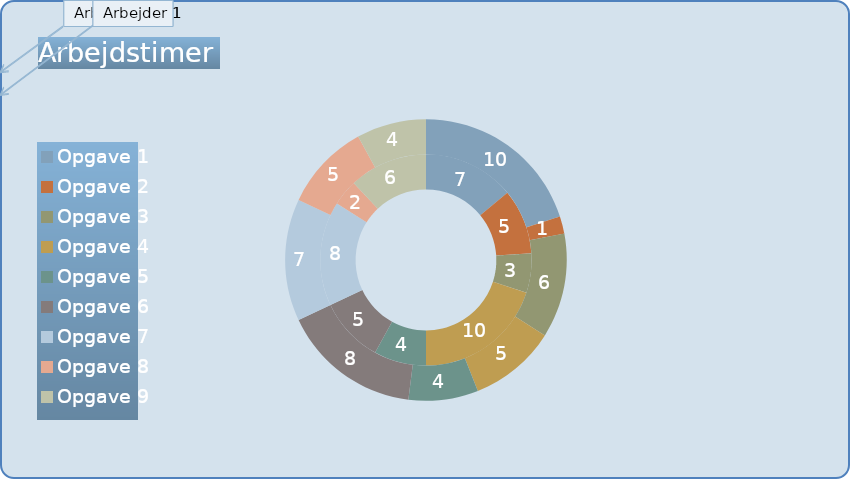
| Category | Arbejder 1 (timer) | Arbejder 2 (timer) |
|---|---|---|
| Opgave 1 | 7 | 10 |
| Opgave 2 | 5 | 1 |
| Opgave 3 | 3 | 6 |
| Opgave 4 | 10 | 5 |
| Opgave 5 | 4 | 4 |
| Opgave 6 | 5 | 8 |
| Opgave 7 | 8 | 7 |
| Opgave 8 | 2 | 5 |
| Opgave 9 | 6 | 4 |